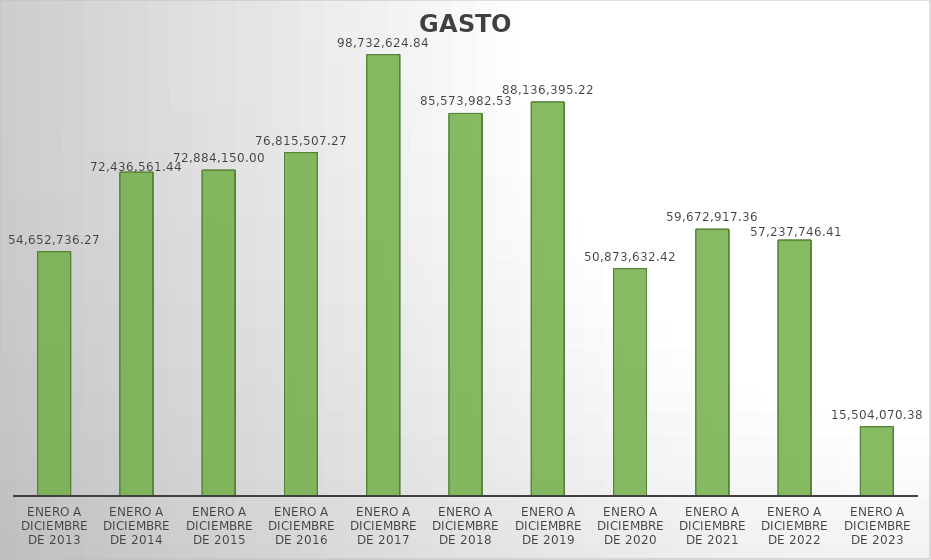
| Category | GASTO TOTAL |
|---|---|
| ENERO A DICIEMBRE DE 2013 | 54652736.27 |
| ENERO A DICIEMBRE DE 2014 | 72436561.44 |
| ENERO A DICIEMBRE DE 2015 | 72884150 |
| ENERO A DICIEMBRE DE 2016 | 76815507.27 |
| ENERO A DICIEMBRE DE 2017 | 98732624.84 |
| ENERO A DICIEMBRE DE 2018 | 85573982.53 |
| ENERO A DICIEMBRE DE 2019 | 88136395.22 |
| ENERO A DICIEMBRE DE 2020 | 50873632.42 |
| ENERO A DICIEMBRE DE 2021 | 59672917.36 |
| ENERO A DICIEMBRE DE 2022 | 57237746.41 |
| ENERO A DICIEMBRE DE 2023 | 15504070.38 |